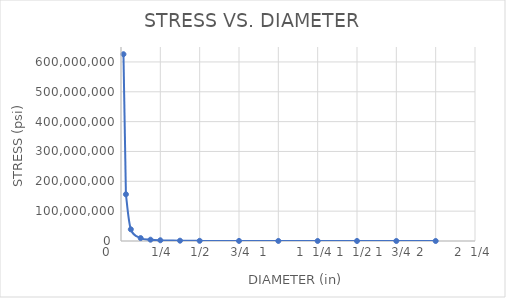
| Category | series 1 |
|---|---|
| 2.0 | 38197.186 |
| 1.75 | 49890.203 |
| 1.5 | 67906.109 |
| 1.25 | 97784.797 |
| 1.0 | 152788.745 |
| 0.75 | 271624.436 |
| 0.5 | 611154.981 |
| 0.375 | 1086497.745 |
| 0.25 | 2444619.926 |
| 0.1875 | 4345990.979 |
| 0.125 | 9778479.704 |
| 0.0625 | 39113918.814 |
| 0.03125 | 156455675.257 |
| 0.015625 | 625822701.028 |